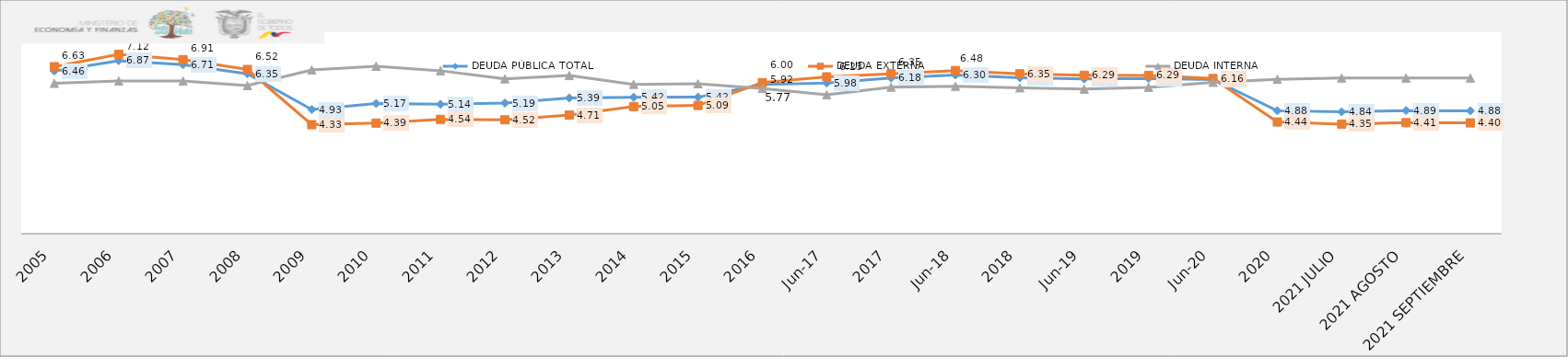
| Category | DEUDA PÚBLICA TOTAL | DEUDA EXTERNA  | DEUDA INTERNA |
|---|---|---|---|
| 2005 | 6.46 | 6.63 | 5.97 |
| 2006 | 6.87 | 7.12 | 6.06 |
| 2007 | 6.71 | 6.91 | 6.06 |
| 2008 | 6.35 | 6.52 | 5.88 |
| 2009 | 4.93 | 4.33 | 6.5 |
| 2010 | 5.17 | 4.39 | 6.65 |
| 2011 | 5.137 | 4.54 | 6.47 |
| 2012 | 5.186 | 4.521 | 6.15 |
| 2013 | 5.391 | 4.709 | 6.28 |
| 2014 | 5.416 | 5.048 | 5.93 |
| 2015 | 5.421 | 5.092 | 5.952 |
| 2016 | 5.922 | 5.998 | 5.767 |
| jun-17 | 5.982 | 6.228 | 5.513 |
| 2017 | 6.181 | 6.35 | 5.817 |
| jun-18 | 6.297 | 6.479 | 5.855 |
| 2018 | 6.195 | 6.35 | 5.792 |
| jun-19 | 6.143 | 6.29 | 5.74 |
| 2019 | 6.164 | 6.285 | 5.811 |
| jun-20 | 6.121 | 6.161 | 6.012 |
| 2020 | 4.881 | 4.437 | 6.132 |
| 2021 JULIO | 4.84 | 4.351 | 6.18 |
| 2021 AGOSTO | 4.89 | 4.41 | 6.18 |
| 2021 SEPTIEMBRE | 4.88 | 4.4 | 6.18 |